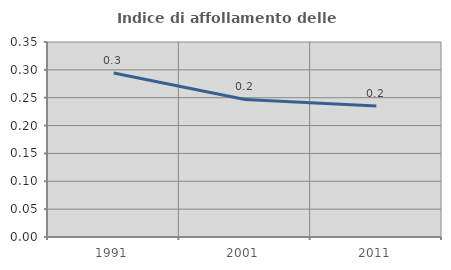
| Category | Indice di affollamento delle abitazioni  |
|---|---|
| 1991.0 | 0.294 |
| 2001.0 | 0.247 |
| 2011.0 | 0.235 |